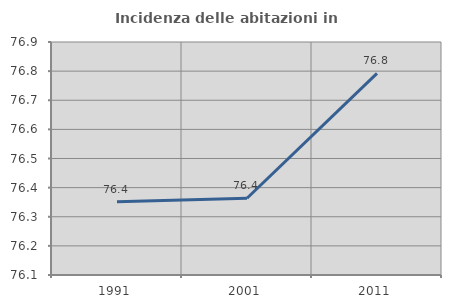
| Category | Incidenza delle abitazioni in proprietà  |
|---|---|
| 1991.0 | 76.352 |
| 2001.0 | 76.364 |
| 2011.0 | 76.792 |